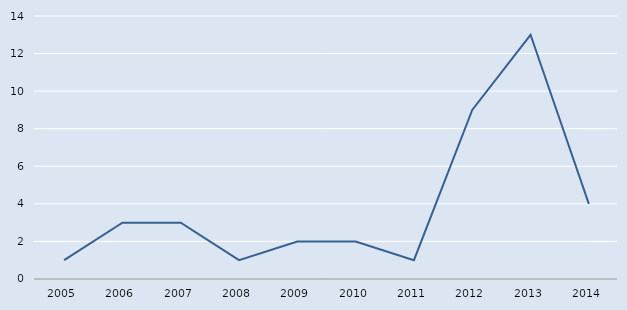
| Category | Series 0 |
|---|---|
| 2005.0 | 1 |
| 2006.0 | 3 |
| 2007.0 | 3 |
| 2008.0 | 1 |
| 2009.0 | 2 |
| 2010.0 | 2 |
| 2011.0 | 1 |
| 2012.0 | 9 |
| 2013.0 | 13 |
| 2014.0 | 4 |